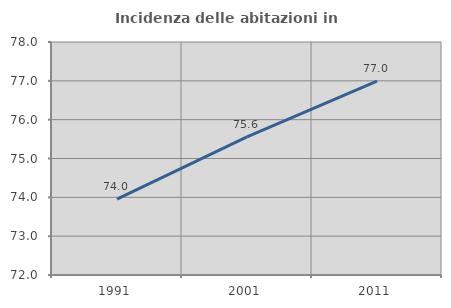
| Category | Incidenza delle abitazioni in proprietà  |
|---|---|
| 1991.0 | 73.952 |
| 2001.0 | 75.558 |
| 2011.0 | 76.994 |